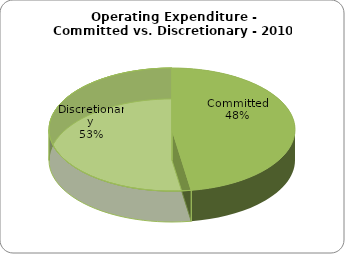
| Category | Series 0 |
|---|---|
| Committed | 19 |
| Discretionary | 21 |